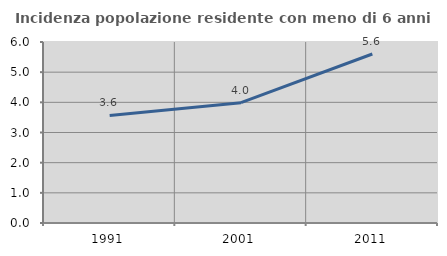
| Category | Incidenza popolazione residente con meno di 6 anni |
|---|---|
| 1991.0 | 3.567 |
| 2001.0 | 3.989 |
| 2011.0 | 5.603 |